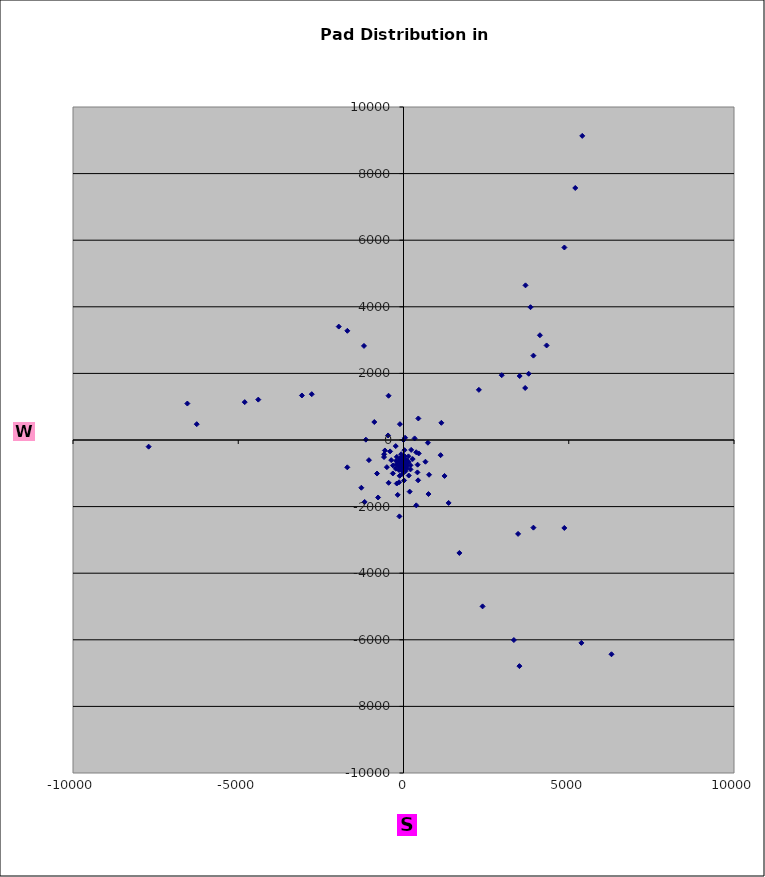
| Category | Series 0 |
|---|---|
| -33.89412596357226 | -712.752 |
| -17.45390886807272 | -709.609 |
| -22.55892920099019 | -691.984 |
| -5.421013145761904 | -723.791 |
| 25.24593898650276 | -744.432 |
| 20.94634824002618 | -721.465 |
| 15.93453511487101 | -700.676 |
| 9.4823358360497 | -687.076 |
| -9.835100333949995 | -663.827 |
| -20.89371519120546 | -653.56 |
| 37.82617818205269 | -735.876 |
| 36.74558622824058 | -720.639 |
| 0.965953711058617 | -702.655 |
| 16.4147401273497 | -673.574 |
| 10.73987942564285 | -659.567 |
| -20.62042133772511 | -633.907 |
| -6.712372688121831 | -684.952 |
| -41.23929871736063 | -725.978 |
| -50.30411069190971 | -711.209 |
| -61.0567538809347 | -722.793 |
| -43.75912667924732 | -692.174 |
| -43.64407228302801 | -652.742 |
| -59.40429339728792 | -667.572 |
| -74.47461587423426 | -684.657 |
| -84.52300419502654 | -704.894 |
| -86.87286754484204 | -732.262 |
| -93.14292454225124 | -745.959 |
| -57.04992893089054 | -645.439 |
| -71.00601758341693 | -655.828 |
| -68.4810736584245 | -698.471 |
| -95.89972539854072 | -694.89 |
| -103.2958482047845 | -719.779 |
| -105.4387376871131 | -755.003 |
| -76.9023209327324 | -718.173 |
| -26.04186157148672 | -726.189 |
| -15.39951252392716 | -746.359 |
| -51.33381026351078 | -746.675 |
| -80.49715673065786 | -765.112 |
| -64.18907113152689 | -771.149 |
| -42.33954857557427 | -777.861 |
| -23.09339255542893 | -778.608 |
| 2.382622675566822 | -763.286 |
| 17.10537160233004 | -766.534 |
| -80.06703000823642 | -780.374 |
| -63.50521219213386 | -786.82 |
| -36.66707353515612 | -762.166 |
| -19.65399721300207 | -794.595 |
| -1.523355240318224 | -788.945 |
| 30.35174916896484 | -773.919 |
| -15.04639783826012 | -764.335 |
| -76.99007016132514 | -805.534 |
| -63.6797807436295 | -813.369 |
| -45.47460700416318 | -822.363 |
| -20.26378435337604 | -817.054 |
| -1.884325761272748 | -817.118 |
| 12.20855283195544 | -808.689 |
| -60.70455403271934 | -834.806 |
| -45.35024699189148 | -846.397 |
| 2.295725003494269 | -836.622 |
| -5.28916760827667 | -862.854 |
| -57.36048875663701 | -861.945 |
| -79.54380248219186 | -828.94 |
| -11.49422361048674 | -843.006 |
| 27.5733466809704 | -827.398 |
| -1.515894297115508 | -616.827 |
| -54.71181707407727 | -616.689 |
| 84.32301106281119 | -698.102 |
| -140.5072280026186 | -651.164 |
| -159.5516085417331 | -789.469 |
| 108.0977935502121 | -762.867 |
| -118.8674637173546 | -582.609 |
| 89.09395348357263 | -599.96 |
| -205.1490475094692 | -724.69 |
| 103.7166566493 | -847.992 |
| -62.64949424878262 | -519.066 |
| -136.0704530792818 | -902.086 |
| 159.5504516988087 | -656.92 |
| -225.2001555394748 | -626.959 |
| 58.74951452428731 | -939.669 |
| 29.38833234828829 | -480.594 |
| -232.6386132255719 | -862.215 |
| 210.951961210872 | -760.34 |
| -201.6202626760209 | -507.585 |
| -34.13008889302512 | -1015.688 |
| 149.6052590461813 | -491.583 |
| -320.5652290082577 | -763.861 |
| 210.998337419142 | -883.466 |
| -71.16718633039952 | -427.394 |
| -115.7063626031167 | -1075.443 |
| 278.4170757048651 | -571.571 |
| -370.9743357828342 | -604.124 |
| 159.5060550781024 | -1067.094 |
| 28.89945077210864 | -305.417 |
| -322.525171931423 | -1004.126 |
| 427.0133243111641 | -741.484 |
| -405.2355233084081 | -342.144 |
| 17.61245514757923 | -1214.453 |
| 232.0339731977165 | -296.682 |
| -503.3144246133901 | -815.466 |
| 420.9728449044486 | -972.774 |
| -235.4166998190335 | -182.536 |
| -203.8338622848964 | -1306.43 |
| 461.1792144726605 | -403.845 |
| -588.9825374947097 | -511.88 |
| 442.0178225991465 | -1210.841 |
| 47.75389386091152 | 67.128 |
| -450.264732828484 | -1285.5 |
| 664.4987581573844 | -652.373 |
| -562.6328909198274 | -314.452 |
| 186.6412212064403 | -1550.361 |
| 336.216480866719 | 47.558 |
| -800.9915428521678 | -1007.194 |
| 772.9368066956521 | -1043.854 |
| -467.3686948089573 | 136.824 |
| -175.9057296187148 | -1647.546 |
| 738.7298503346883 | -82.156 |
| -1046.662636302646 | -604.865 |
| 755.8413205719784 | -1622.601 |
| -108.882291469793 | 476.22 |
| -768.8428761667834 | -1726.665 |
| 1123.288650954715 | -455.27 |
| -1137.979806929995 | 9.996 |
| 386.347696506674 | -1962.095 |
| 448.2469952530232 | 646.127 |
| -1275.85149499908 | -1433.666 |
| 1241.720548619841 | -1079.905 |
| -883.220932280697 | 539.71 |
| -124.3585508455101 | -2293.772 |
| 1145.061893670181 | 515.909 |
| -1700.499583739003 | -820.642 |
| 1365.742593781019 | -1889.698 |
| -452.4801063630442 | 1329.186 |
| -1175.121588044477 | -1860.25 |
| -134.0818846622119 | -1268.799 |
| 384.7919547765164 | -367.457 |
| -586.6863143497455 | -428.775 |
| 13.04464133405276 | -559.815 |
| -38.94285882657312 | -920.63 |
| 2280.670203451464 | 1505.47 |
| 3681.578873099931 | 1562.445 |
| 3515.380175869834 | 1921.387 |
| 2972.503897745068 | 1946.242 |
| 3788.367380430776 | 1989.624 |
| 3930.7346162968 | 2533.603 |
| 4329.946921689742 | 2839.504 |
| 4127.867060616376 | 3145.917 |
| 3843.347823275622 | 3987.669 |
| 3691.44229630874 | 4644.272 |
| 4868.175323372567 | 5781.182 |
| 5196.733074313565 | 7567.583 |
| 5408.02887217023 | 9132.724 |
| 1691.020292843597 | -3392.215 |
| 2393.11758090311 | -4995.846 |
| 3339.655831398891 | -6007.169 |
| 3467.362039559618 | -2819.849 |
| 3507.387264784914 | -6790.519 |
| 3930.894724185483 | -2631.923 |
| 4865.80980326637 | -2641.452 |
| 5382.450970173936 | -6092.657 |
| 6293.279820673535 | -6434.262 |
| -7710.901802912153 | -200.06 |
| -6540.27060674536 | 1095.12 |
| -6256.10312582522 | 474.994 |
| -4804.215016194097 | 1136.997 |
| -4393.451962748275 | 1212.565 |
| -3073.179450948718 | 1336.906 |
| -2775.51087611007 | 1375.775 |
| -1958.697828065393 | 3405.644 |
| -1699.369738206145 | 3279.324 |
| -1195.80262068699 | 2825.22 |
| -37.01384552408969 | -551.932 |
| -49.28641964749416 | -547.231 |
| -58.14574425995811 | -547.207 |
| -58.37145079627209 | -591.284 |
| -48.38812947993981 | -595.173 |
| -38.88669906308797 | -585.953 |
| -47.99531371141682 | -564.859 |
| -55.96985521790928 | -568.82 |
| -48.84480313920679 | -574.436 |
| -35.89239576043346 | -569.621 |
| -65.31846157165374 | -560.701 |
| -63.03702802126521 | -574.717 |
| -36.945136100784 | -560.01 |
| -49.2177137967548 | -555.309 |
| -58.07695153969789 | -555.294 |
| -58.44032562501012 | -583.186 |
| -50.54653872522958 | -587.384 |
| -40.68629066720713 | -577.98 |
| -87.20863884420145 | -542.148 |
| -81.69727114099489 | -601.663 |
| -15.18466358650647 | -595.091 |
| -15.15670495888324 | -539.533 |
| 0.0 | 0 |